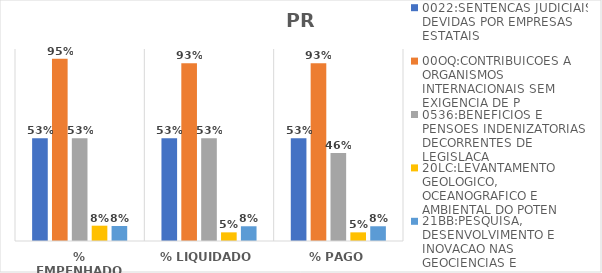
| Category | 0022:SENTENCAS JUDICIAIS DEVIDAS POR EMPRESAS ESTATAIS | 00OQ:CONTRIBUICOES A ORGANISMOS INTERNACIONAIS SEM EXIGENCIA DE P | 0536:BENEFICIOS E PENSOES INDENIZATORIAS DECORRENTES DE LEGISLACA | 20LC:LEVANTAMENTO GEOLOGICO, OCEANOGRAFICO E AMBIENTAL DO POTEN | 21BB:PESQUISA, DESENVOLVIMENTO E INOVACAO NAS GEOCIENCIAS E |
|---|---|---|---|---|---|
| % EMPENHADO | 0.535 | 0.95 | 0.535 | 0.08 | 0.078 |
| % LIQUIDADO | 0.535 | 0.926 | 0.535 | 0.045 | 0.077 |
| % PAGO | 0.535 | 0.926 | 0.459 | 0.045 | 0.077 |